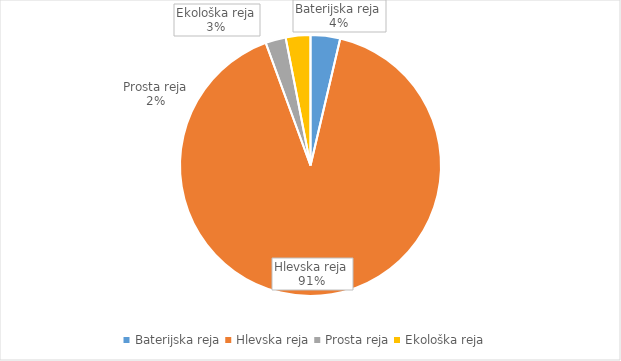
| Category | Količina kosov jajc |
|---|---|
| Baterijska reja | 122010 |
| Hlevska reja | 3024739 |
| Prosta reja | 83681 |
| Ekološka reja | 102000 |